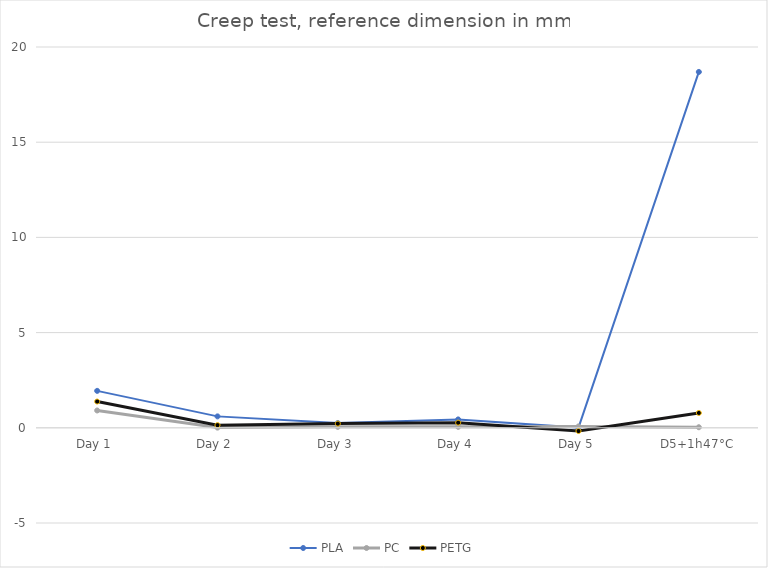
| Category | PLA | PC | PETG |
|---|---|---|---|
| Day 1 | 1.94 | 0.91 | 1.38 |
| Day 2 | 0.6 | 0.01 | 0.14 |
| Day 3 | 0.25 | 0.05 | 0.22 |
| Day 4 | 0.44 | 0.05 | 0.27 |
| Day 5 | 0.01 | 0.07 | -0.17 |
| D5+1h47°C | 18.69 | 0.03 | 0.78 |